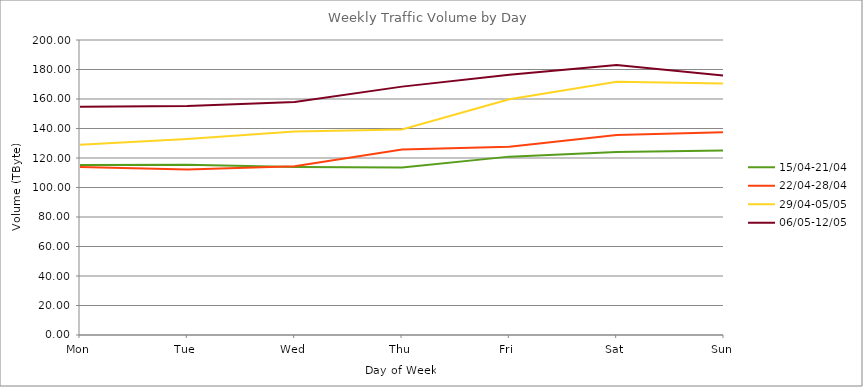
| Category | 15/04-21/04 | 22/04-28/04 | 29/04-05/05 | 06/05-12/05 |
|---|---|---|---|---|
| Mon | 115.18 | 113.91 | 128.99 | 154.8 |
| Tue | 115.45 | 112.15 | 132.82 | 155.19 |
| Wed | 113.98 | 114.39 | 137.96 | 157.89 |
| Thu | 113.51 | 125.82 | 139.31 | 168.39 |
| Fri | 120.93 | 127.55 | 159.81 | 176.41 |
| Sat | 124.15 | 135.57 | 171.72 | 182.99 |
| Sun | 125.09 | 137.44 | 170.51 | 175.91 |